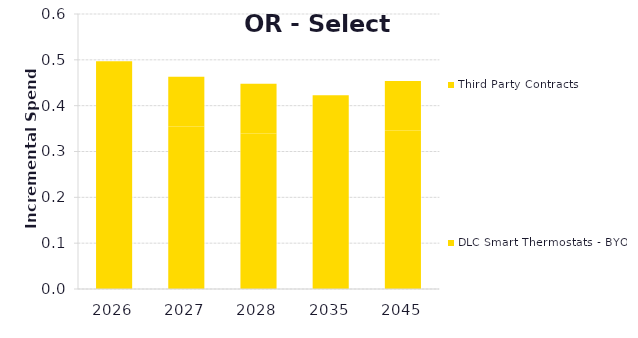
| Category | DLC Smart Thermostats - BYOT | Third Party Contracts |
|---|---|---|
| 2026.0 | 0.388 | 0.108 |
| 2027.0 | 0.355 | 0.108 |
| 2028.0 | 0.339 | 0.108 |
| 2035.0 | 0.314 | 0.108 |
| 2045.0 | 0.346 | 0.108 |